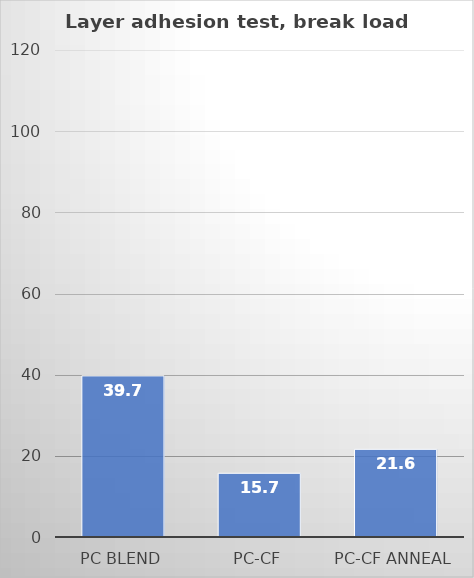
| Category | Average |
|---|---|
| PC blend | 39.7 |
| PC-CF | 15.7 |
| PC-CF anneal | 21.6 |